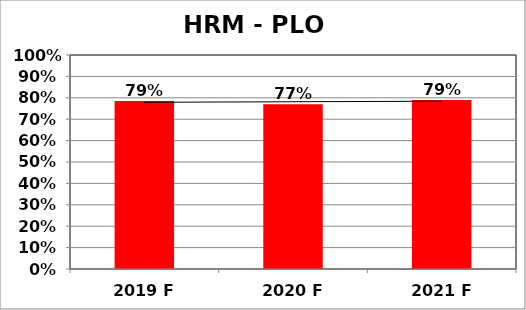
| Category | Series 0 |
|---|---|
| 2019 F | 0.785 |
| 2020 F | 0.77 |
| 2021 F | 0.79 |